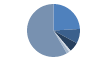
| Category | Series 0 |
|---|---|
| ARRASTRE | 331 |
| CERCO | 122 |
| PALANGRE | 81 |
| REDES DE ENMALLE | 15 |
| ARTES FIJAS | 23 |
| ARTES MENORES | 804 |